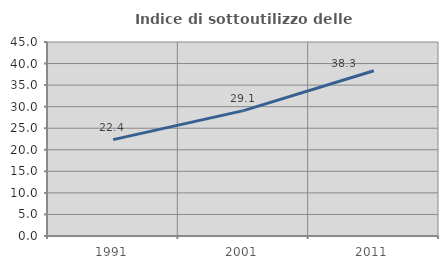
| Category | Indice di sottoutilizzo delle abitazioni  |
|---|---|
| 1991.0 | 22.36 |
| 2001.0 | 29.086 |
| 2011.0 | 38.333 |